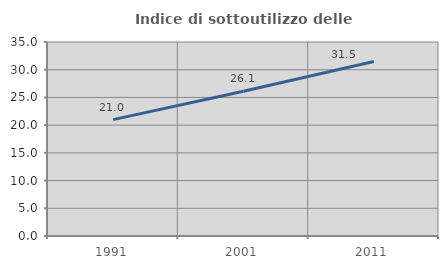
| Category | Indice di sottoutilizzo delle abitazioni  |
|---|---|
| 1991.0 | 20.995 |
| 2001.0 | 26.119 |
| 2011.0 | 31.491 |